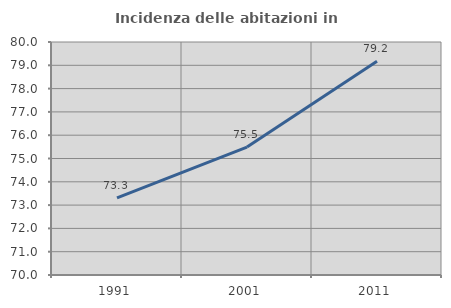
| Category | Incidenza delle abitazioni in proprietà  |
|---|---|
| 1991.0 | 73.309 |
| 2001.0 | 75.488 |
| 2011.0 | 79.177 |